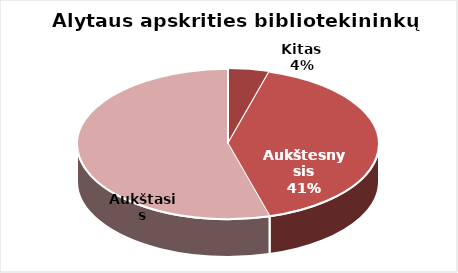
| Category | Series 0 |
|---|---|
| Kitas | 7 |
| Aukštesnysis | 65 |
| Aukštasis | 86 |